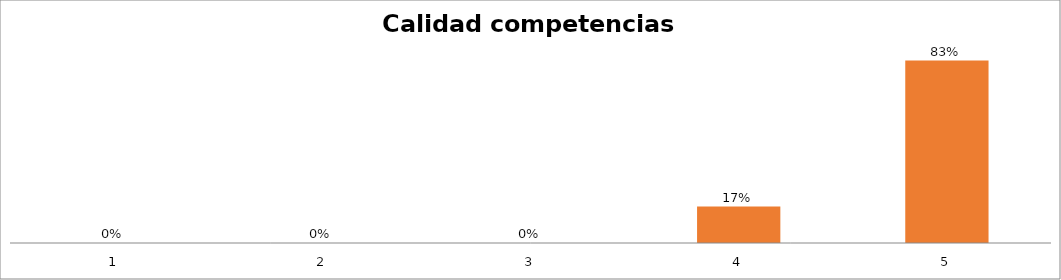
| Category | Series 1 |
|---|---|
| 0 | 0 |
| 1 | 0 |
| 2 | 0 |
| 3 | 0.167 |
| 4 | 0.833 |